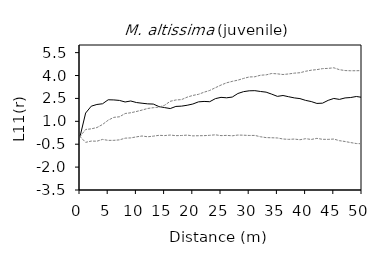
| Category | E11- | E11+ | Expect |
|---|---|---|---|
| 0.0 | 0 | 0 | 0 |
| 1.0 | 1.543 | -0.377 | 0.464 |
| 2.0 | 1.993 | -0.294 | 0.507 |
| 3.0 | 2.104 | -0.302 | 0.592 |
| 4.0 | 2.15 | -0.186 | 0.793 |
| 5.0 | 2.411 | -0.248 | 1.074 |
| 6.0 | 2.401 | -0.247 | 1.259 |
| 7.0 | 2.368 | -0.216 | 1.297 |
| 8.0 | 2.267 | -0.104 | 1.511 |
| 9.0 | 2.332 | -0.087 | 1.56 |
| 10.0 | 2.231 | -0.019 | 1.644 |
| 11.0 | 2.185 | 0.038 | 1.736 |
| 12.0 | 2.144 | -0.013 | 1.842 |
| 13.0 | 2.13 | 0.028 | 1.892 |
| 14.0 | 1.966 | 0.082 | 1.93 |
| 15.0 | 1.899 | 0.066 | 2.051 |
| 16.0 | 1.836 | 0.1 | 2.311 |
| 17.0 | 1.975 | 0.06 | 2.399 |
| 18.0 | 1.995 | 0.07 | 2.422 |
| 19.0 | 2.052 | 0.096 | 2.584 |
| 20.0 | 2.133 | 0.047 | 2.695 |
| 21.0 | 2.275 | 0.056 | 2.768 |
| 22.0 | 2.302 | 0.061 | 2.908 |
| 23.0 | 2.285 | 0.083 | 3.023 |
| 24.0 | 2.485 | 0.116 | 3.201 |
| 25.0 | 2.57 | 0.063 | 3.375 |
| 26.0 | 2.54 | 0.078 | 3.524 |
| 27.0 | 2.59 | 0.052 | 3.618 |
| 28.0 | 2.823 | 0.1 | 3.698 |
| 29.0 | 2.943 | 0.091 | 3.81 |
| 30.0 | 2.999 | 0.073 | 3.906 |
| 31.0 | 3.008 | 0.076 | 3.918 |
| 32.0 | 2.955 | -0.011 | 4.02 |
| 33.0 | 2.911 | -0.067 | 4.044 |
| 34.0 | 2.779 | -0.078 | 4.134 |
| 35.0 | 2.635 | -0.091 | 4.11 |
| 36.0 | 2.691 | -0.159 | 4.066 |
| 37.0 | 2.61 | -0.183 | 4.104 |
| 38.0 | 2.534 | -0.162 | 4.156 |
| 39.0 | 2.488 | -0.207 | 4.183 |
| 40.0 | 2.371 | -0.138 | 4.279 |
| 41.0 | 2.295 | -0.187 | 4.349 |
| 42.0 | 2.172 | -0.117 | 4.386 |
| 43.0 | 2.189 | -0.179 | 4.451 |
| 44.0 | 2.374 | -0.183 | 4.469 |
| 45.0 | 2.498 | -0.162 | 4.507 |
| 46.0 | 2.436 | -0.268 | 4.383 |
| 47.0 | 2.532 | -0.323 | 4.326 |
| 48.0 | 2.559 | -0.394 | 4.313 |
| 49.0 | 2.627 | -0.455 | 4.314 |
| 50.0 | 2.569 | -0.469 | 4.325 |